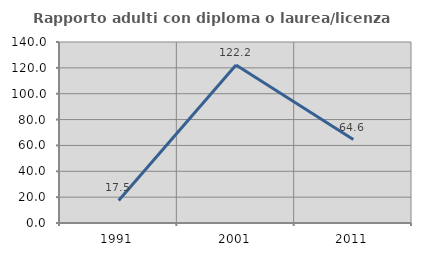
| Category | Rapporto adulti con diploma o laurea/licenza media  |
|---|---|
| 1991.0 | 17.46 |
| 2001.0 | 122.222 |
| 2011.0 | 64.583 |